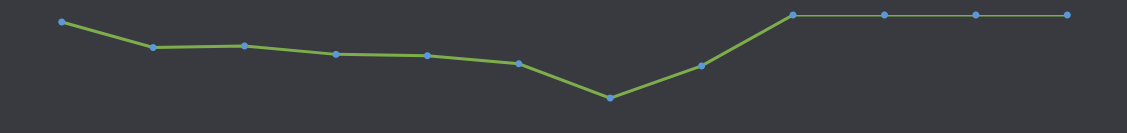
| Category | Dostupna gotovina |
|---|---|
| JAN | -1700 |
| FEB | -7901 |
| MAR | -7513 |
| APR | -9556 |
| MAJ | -9877 |
| JUN | -11826 |
| JUL | -20164 |
| AVG | -12362 |
| SEP | 0 |
| OKT | 0 |
| NOV | 0 |
| DEC | 0 |